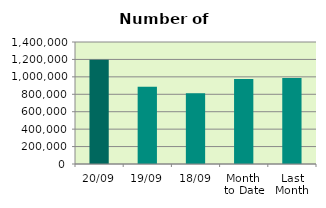
| Category | Series 0 |
|---|---|
| 20/09 | 1195514 |
| 19/09 | 885794 |
| 18/09 | 811828 |
| Month 
to Date | 976694 |
| Last
Month | 986270.455 |